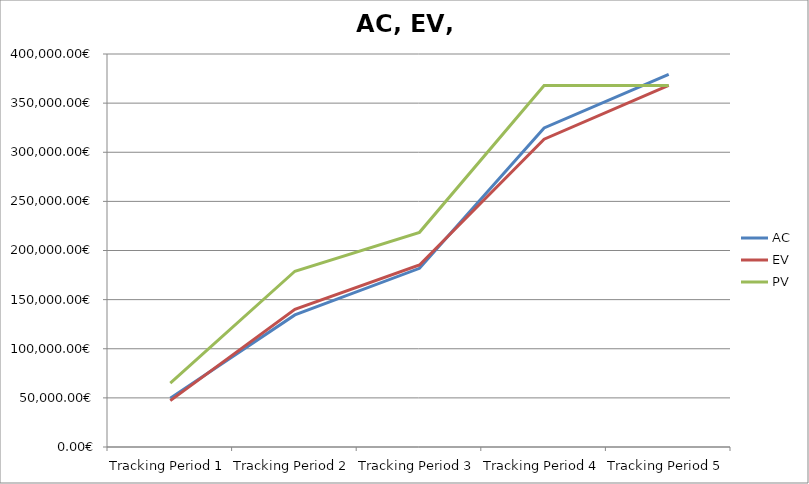
| Category | AC | EV | PV |
|---|---|---|---|
| Tracking Period 1 | 49705 | 47225 | 65089 |
| Tracking Period 2 | 134473 | 140238 | 178889 |
| Tracking Period 3 | 181871 | 185277 | 218500 |
| Tracking Period 4 | 324716 | 313304 | 367952 |
| Tracking Period 5 | 379300 | 367952 | 367952 |